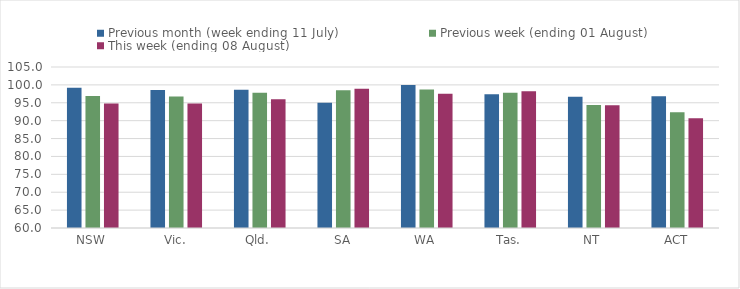
| Category | Previous month (week ending 11 July) | Previous week (ending 01 August) | This week (ending 08 August) |
|---|---|---|---|
| NSW | 99.171 | 96.891 | 94.765 |
| Vic. | 98.564 | 96.767 | 94.78 |
| Qld. | 98.638 | 97.826 | 96.017 |
| SA | 95.03 | 98.524 | 98.92 |
| WA | 99.986 | 98.7 | 97.527 |
| Tas. | 97.373 | 97.82 | 98.237 |
| NT | 96.667 | 94.383 | 94.319 |
| ACT | 96.795 | 92.379 | 90.667 |